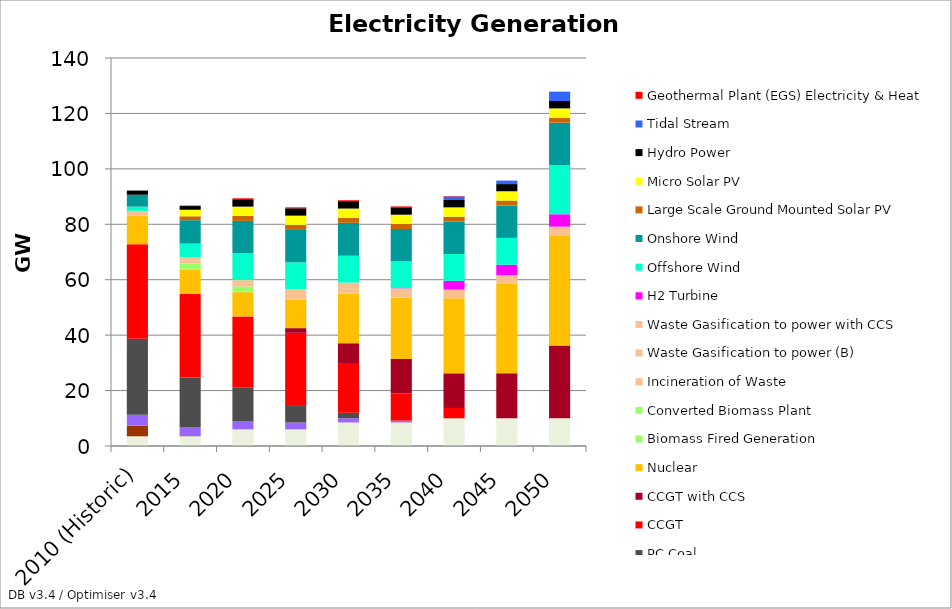
| Category | Interconnector Benelux-Germany (Electricity) | Interconnector France (Electricity) | Interconnector Ireland (Electricity) | Interconnector Nordel (Electricity) | Oil Fired Generation | OCGT | PC Coal | CCGT | CCGT with CCS | Nuclear | Biomass Fired Generation | Converted Biomass Plant | Incineration of Waste | Waste Gasification to power (B) | Waste Gasification to power with CCS | H2 Turbine | Offshore Wind | Onshore Wind | Large Scale Ground Mounted Solar PV | Micro Solar PV | Hydro Power | Tidal Stream | Geothermal Plant (EGS) Electricity & Heat |
|---|---|---|---|---|---|---|---|---|---|---|---|---|---|---|---|---|---|---|---|---|---|---|---|
| 2010 (Historic) | 1 | 2 | 0.5 | 0 | 3.8 | 3.98 | 27.42 | 34.1 | 0 | 10.17 | 0.3 | 0 | 1.6 | 0 | 0 | 0 | 1.49 | 4.3 | 0 | 0 | 1.5 | 0 | 0 |
| 2015 | 1 | 2 | 0.5 | 0 | 0.066 | 3.316 | 17.848 | 30.236 | 0 | 8.741 | 0.225 | 1.875 | 1.2 | 1.179 | 0 | 0 | 4.845 | 8.435 | 1.418 | 2.356 | 1.341 | 0 | 0.175 |
| 2020 | 1 | 3 | 1 | 1 | 0 | 2.824 | 12.195 | 25.75 | 0 | 8.742 | 0.18 | 1.873 | 0.96 | 1.179 | 0.162 | 0 | 9.682 | 11.676 | 1.793 | 3.356 | 2.66 | 0 | 0.337 |
| 2025 | 1 | 3 | 1 | 1 | 0 | 2.483 | 6.297 | 26.066 | 1.679 | 10.381 | 0.135 | 0 | 0.72 | 1.179 | 1.666 | 0 | 9.682 | 11.676 | 1.793 | 3.356 | 2.66 | 0 | 0.337 |
| 2030 | 1 | 4 | 1.5 | 2 | 0 | 1.523 | 2.006 | 17.603 | 7.448 | 17.881 | 0.09 | 0 | 0.48 | 1.179 | 2.26 | 0 | 9.682 | 11.877 | 1.793 | 3.356 | 2.66 | 0 | 0.337 |
| 2035 | 1 | 4 | 1.5 | 2 | 0 | 0.663 | 0 | 9.769 | 12.496 | 22.001 | 0.045 | 0 | 0.24 | 0 | 3.139 | 0.094 | 9.682 | 11.676 | 1.793 | 3.356 | 2.66 | 0 | 0.337 |
| 2040 | 1 | 5 | 2 | 2 | 0 | 0 | 0 | 3.722 | 12.496 | 27.091 | 0 | 0 | 0 | 0 | 3.138 | 3.148 | 9.682 | 11.676 | 1.793 | 3.356 | 2.66 | 1.26 | 0.162 |
| 2045 | 1 | 5 | 2 | 2 | 0 | 0 | 0 | 0 | 16.218 | 32.301 | 0 | 0 | 0 | 0 | 3.137 | 3.754 | 9.682 | 11.676 | 1.793 | 3.356 | 2.59 | 1.26 | 0 |
| 2050 | 1 | 5 | 2 | 2 | 0 | 0 | 0 | 0 | 26.218 | 39.8 | 0 | 0 | 0 | 0 | 3.138 | 4.458 | 17.657 | 15.397 | 1.793 | 3.356 | 2.66 | 3.379 | 0 |